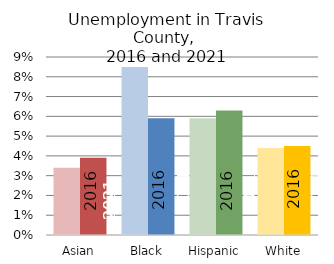
| Category | Series 0 | Series 1 |
|---|---|---|
| Asian | 0.034 | 0.039 |
| Black | 0.085 | 0.059 |
| Hispanic | 0.059 | 0.063 |
| White | 0.044 | 0.045 |